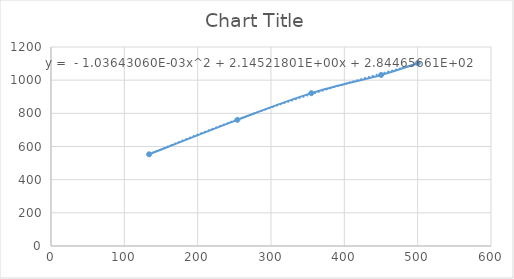
| Category | Series 0 |
|---|---|
| 133.768339 | 553 |
| 254.186551 | 760.7 |
| 354.986764 | 921.676 |
| 450.174779 | 1031.276 |
| 500.134295 | 1102.665 |